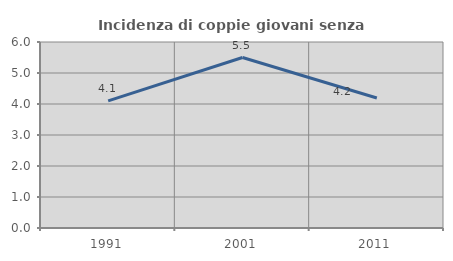
| Category | Incidenza di coppie giovani senza figli |
|---|---|
| 1991.0 | 4.103 |
| 2001.0 | 5.5 |
| 2011.0 | 4.192 |